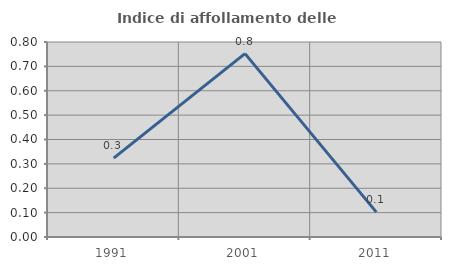
| Category | Indice di affollamento delle abitazioni  |
|---|---|
| 1991.0 | 0.324 |
| 2001.0 | 0.752 |
| 2011.0 | 0.102 |